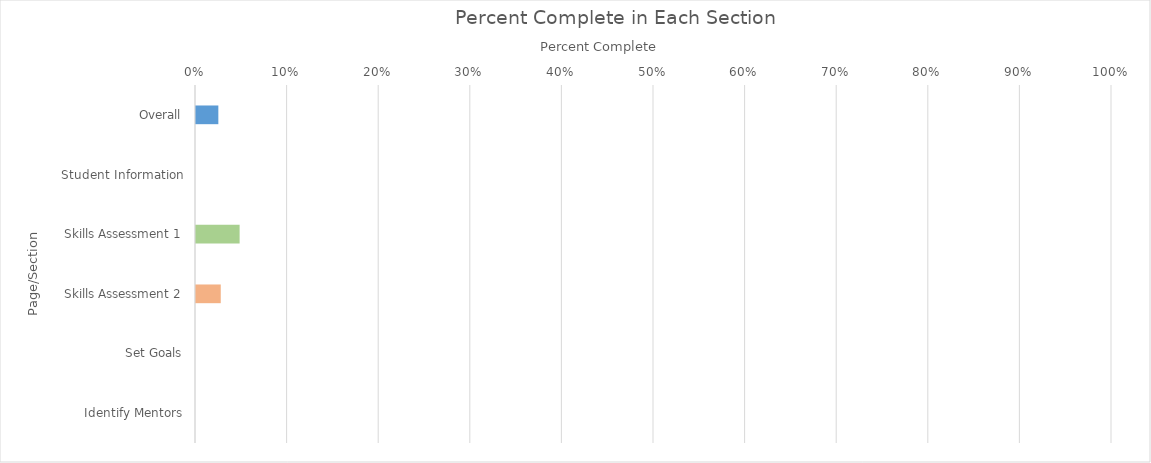
| Category | Series 0 |
|---|---|
| Overall | 0.024 |
| Student Information | 0 |
| Skills Assessment 1 | 0.048 |
| Skills Assessment 2 | 0.027 |
| Set Goals | 0 |
| Identify Mentors | 0 |